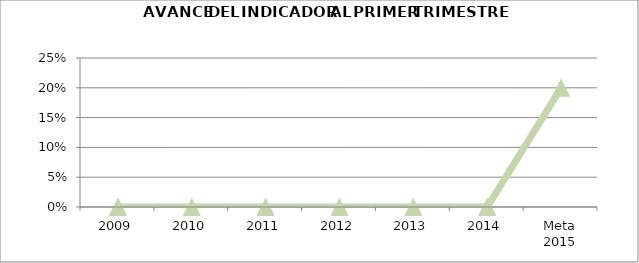
| Category | Series 2 |
|---|---|
| 2009 | 0 |
| 2010 | 0 |
| 2011 | 0 |
| 2012 | 0 |
| 2013 | 0 |
| 2014 | 0 |
| Meta 2015 | 0.2 |